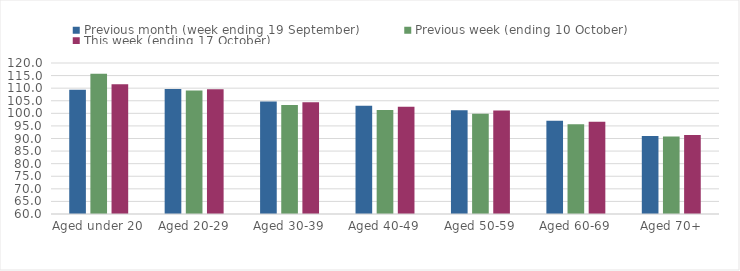
| Category | Previous month (week ending 19 September) | Previous week (ending 10 October) | This week (ending 17 October) |
|---|---|---|---|
| Aged under 20 | 109.4 | 115.68 | 111.59 |
| Aged 20-29 | 109.64 | 109.03 | 109.52 |
| Aged 30-39 | 104.67 | 103.27 | 104.38 |
| Aged 40-49 | 103.06 | 101.31 | 102.65 |
| Aged 50-59 | 101.21 | 99.84 | 101.15 |
| Aged 60-69 | 97.06 | 95.69 | 96.69 |
| Aged 70+ | 91.01 | 90.82 | 91.35 |